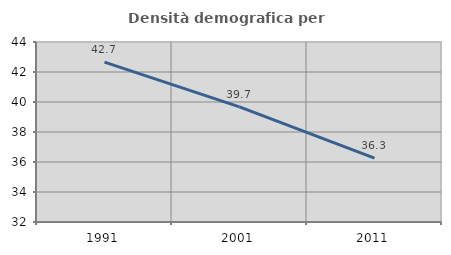
| Category | Densità demografica |
|---|---|
| 1991.0 | 42.663 |
| 2001.0 | 39.676 |
| 2011.0 | 36.257 |